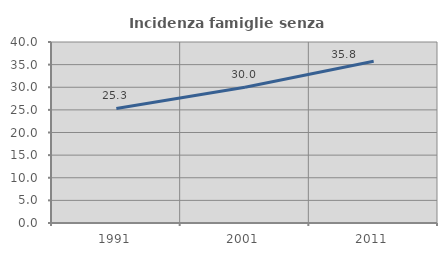
| Category | Incidenza famiglie senza nuclei |
|---|---|
| 1991.0 | 25.316 |
| 2001.0 | 30 |
| 2011.0 | 35.763 |